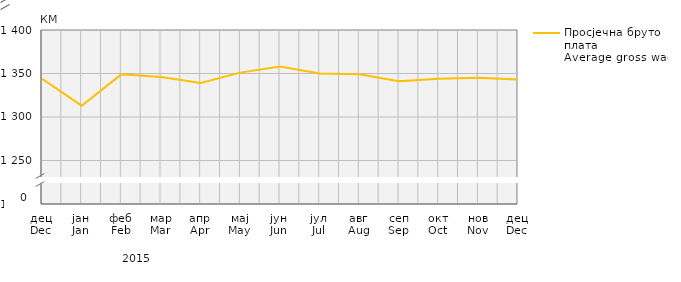
| Category | Просјечна бруто плата
Average gross wage |
|---|---|
| дец
Dec | 1344 |
| јан
Jan | 1313 |
| феб
Feb | 1349 |
| мар
Mar | 1346 |
| апр
Apr | 1339 |
| мај
May | 1351 |
| јун
Jun | 1358 |
| јул
Jul | 1350 |
| авг
Aug | 1349 |
| сеп
Sep | 1341 |
| окт
Oct | 1344 |
| нов
Nov | 1345 |
| дец
Dec | 1343 |